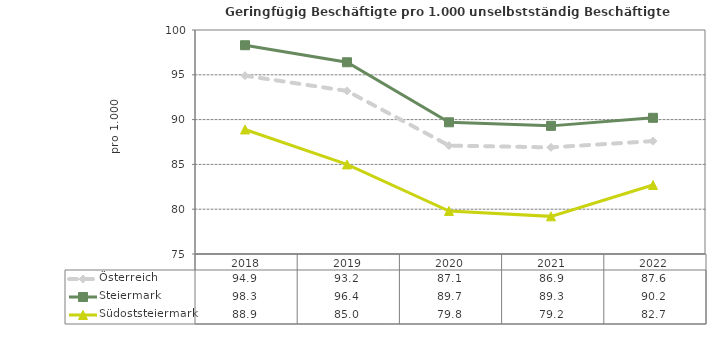
| Category | Österreich | Steiermark | Südoststeiermark |
|---|---|---|---|
| 2022.0 | 87.6 | 90.2 | 82.7 |
| 2021.0 | 86.9 | 89.3 | 79.2 |
| 2020.0 | 87.1 | 89.7 | 79.8 |
| 2019.0 | 93.2 | 96.4 | 85 |
| 2018.0 | 94.9 | 98.3 | 88.9 |